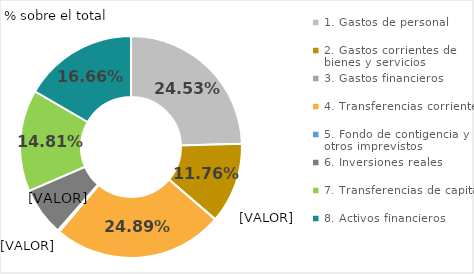
| Category | Series 0 |
|---|---|
| 1. Servicios públicos básicos | 0.104 |
| 2. Actuaciones de protección y promoción social | 0.129 |
| 3. Producción de bienes públicos de carácter preferente | 0.16 |
| 4. Actuaciones de carácter económico  | 0.155 |
| 9. Actuaciones de carácter general | 0.453 |